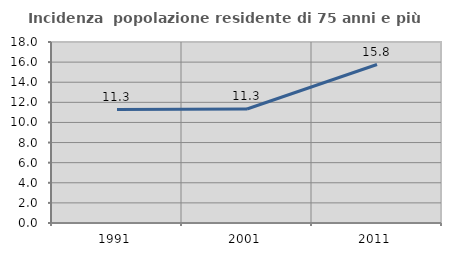
| Category | Incidenza  popolazione residente di 75 anni e più |
|---|---|
| 1991.0 | 11.28 |
| 2001.0 | 11.337 |
| 2011.0 | 15.762 |